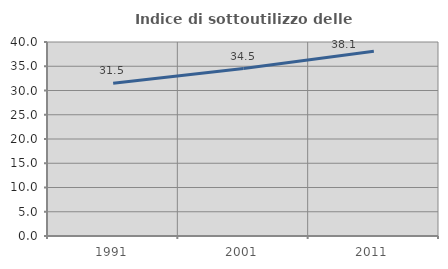
| Category | Indice di sottoutilizzo delle abitazioni  |
|---|---|
| 1991.0 | 31.484 |
| 2001.0 | 34.514 |
| 2011.0 | 38.089 |